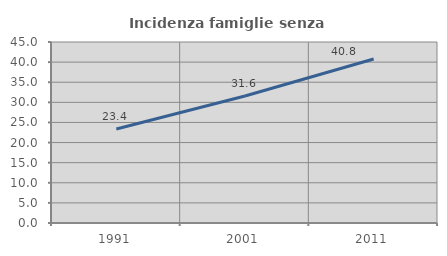
| Category | Incidenza famiglie senza nuclei |
|---|---|
| 1991.0 | 23.382 |
| 2001.0 | 31.569 |
| 2011.0 | 40.777 |